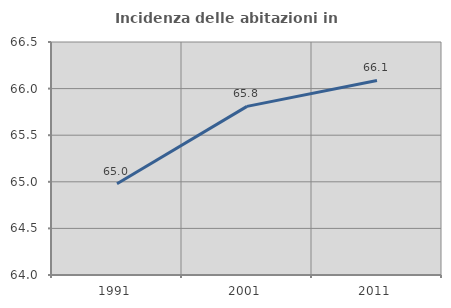
| Category | Incidenza delle abitazioni in proprietà  |
|---|---|
| 1991.0 | 64.98 |
| 2001.0 | 65.81 |
| 2011.0 | 66.088 |